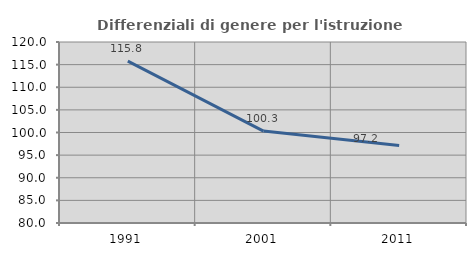
| Category | Differenziali di genere per l'istruzione superiore |
|---|---|
| 1991.0 | 115.757 |
| 2001.0 | 100.306 |
| 2011.0 | 97.153 |